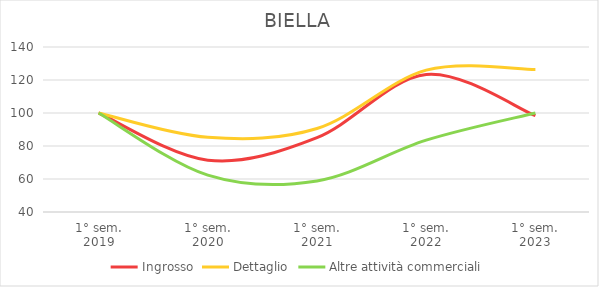
| Category | Ingrosso | Dettaglio | Altre attività commerciali |
|---|---|---|---|
| 1° sem.
2019 | 100 | 100 | 100 |
| 1° sem.
2020 | 71.429 | 85.267 | 62.353 |
| 1° sem.
2021 | 85.065 | 90.608 | 58.824 |
| 1° sem.
2022 | 123.377 | 125.967 | 83.529 |
| 1° sem.
2023 | 98.377 | 126.335 | 100 |